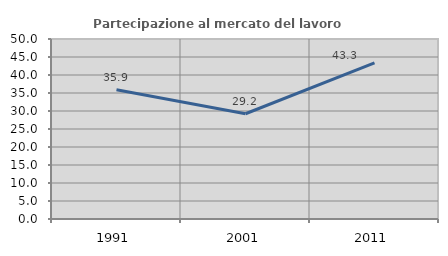
| Category | Partecipazione al mercato del lavoro  femminile |
|---|---|
| 1991.0 | 35.9 |
| 2001.0 | 29.232 |
| 2011.0 | 43.343 |